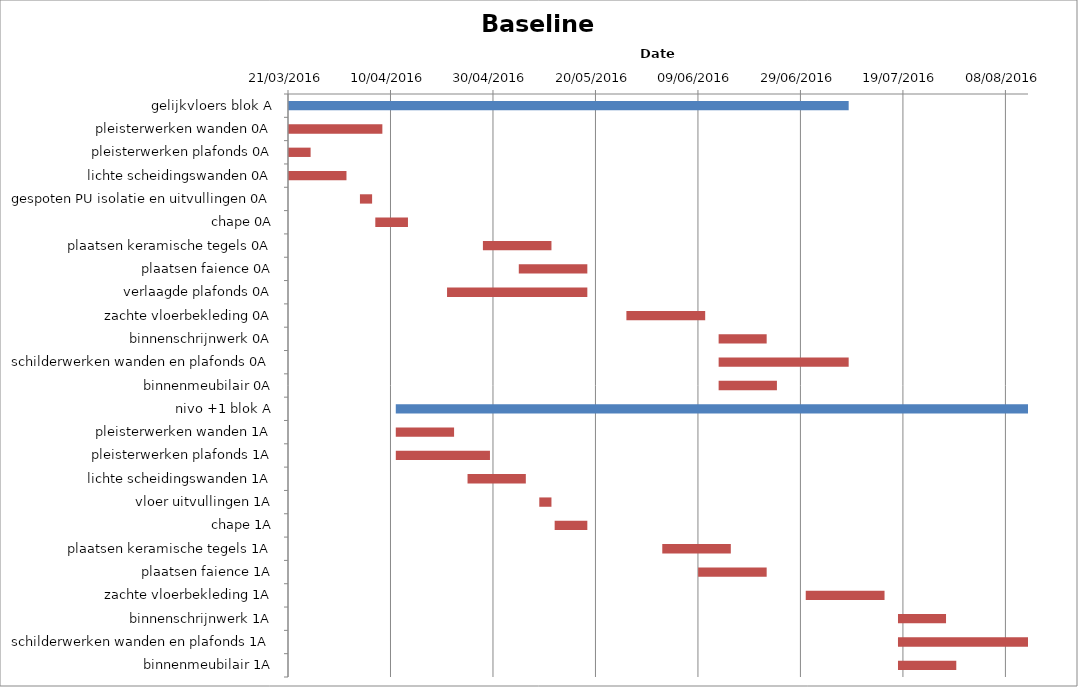
| Category | Baseline start | Actual duration |
|---|---|---|
| gelijkvloers blok A | 42450.333 | 109.375 |
| pleisterwerken wanden 0A | 42450.333 | 18.375 |
| pleisterwerken plafonds 0A | 42450.333 | 4.375 |
| lichte scheidingswanden 0A | 42450.333 | 11.375 |
| gespoten PU isolatie en uitvullingen 0A | 42464.333 | 2.375 |
| chape 0A | 42467.333 | 6.375 |
| plaatsen keramische tegels 0A | 42488.333 | 13.375 |
| plaatsen faience 0A | 42495.333 | 13.375 |
| verlaagde plafonds 0A | 42481.333 | 27.375 |
| zachte vloerbekleding 0A | 42516.333 | 15.375 |
| binnenschrijnwerk 0A | 42534.333 | 9.375 |
| schilderwerken wanden en plafonds 0A | 42534.333 | 25.375 |
| binnenmeubilair 0A | 42534.333 | 11.375 |
| nivo +1 blok A | 42471.333 | 123.375 |
| pleisterwerken wanden 1A | 42471.333 | 11.375 |
| pleisterwerken plafonds 1A | 42471.333 | 18.375 |
| lichte scheidingswanden 1A | 42485.333 | 11.375 |
| vloer uitvullingen 1A | 42499.333 | 2.375 |
| chape 1A | 42502.333 | 6.375 |
| plaatsen keramische tegels 1A | 42523.333 | 13.375 |
| plaatsen faience 1A | 42530.333 | 13.375 |
| zachte vloerbekleding 1A | 42551.333 | 15.375 |
| binnenschrijnwerk 1A | 42569.333 | 9.375 |
| schilderwerken wanden en plafonds 1A | 42569.333 | 25.375 |
| binnenmeubilair 1A | 42569.333 | 11.375 |